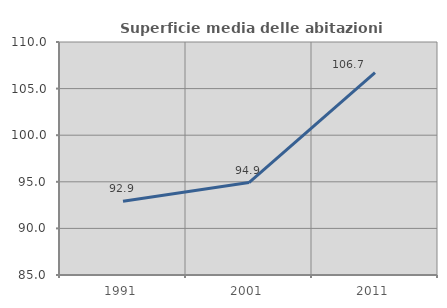
| Category | Superficie media delle abitazioni occupate |
|---|---|
| 1991.0 | 92.91 |
| 2001.0 | 94.92 |
| 2011.0 | 106.704 |